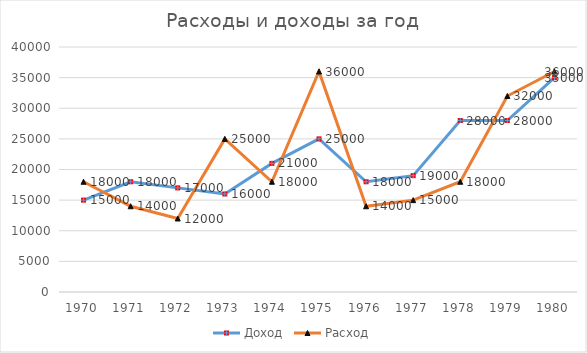
| Category | Доход | Расход |
|---|---|---|
| 1970.0 | 15000 | 18000 |
| 1971.0 | 18000 | 14000 |
| 1972.0 | 17000 | 12000 |
| 1973.0 | 16000 | 25000 |
| 1974.0 | 21000 | 18000 |
| 1975.0 | 25000 | 36000 |
| 1976.0 | 18000 | 14000 |
| 1977.0 | 19000 | 15000 |
| 1978.0 | 28000 | 18000 |
| 1979.0 | 28000 | 32000 |
| 1980.0 | 35000 | 36000 |